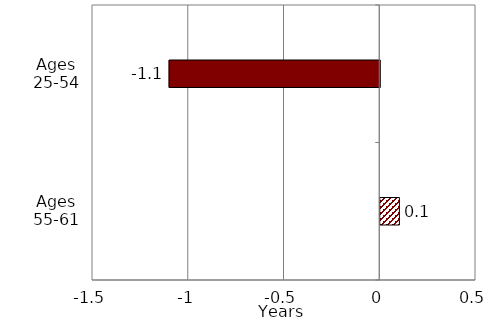
| Category | Series 0 |
|---|---|
| Ages 55-61 | 0.1 |
| Ages 25-54 | -1.1 |